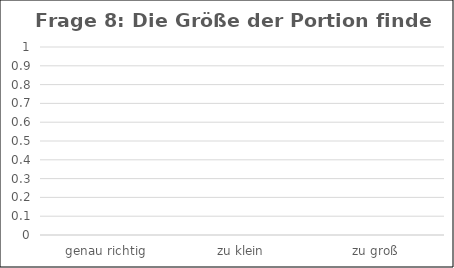
| Category | Series 0 |
|---|---|
| genau richtig | 0 |
| zu klein | 0 |
| zu groß | 0 |